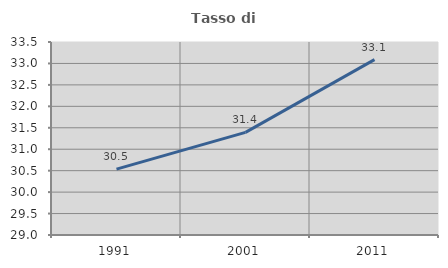
| Category | Tasso di occupazione   |
|---|---|
| 1991.0 | 30.536 |
| 2001.0 | 31.393 |
| 2011.0 | 33.09 |